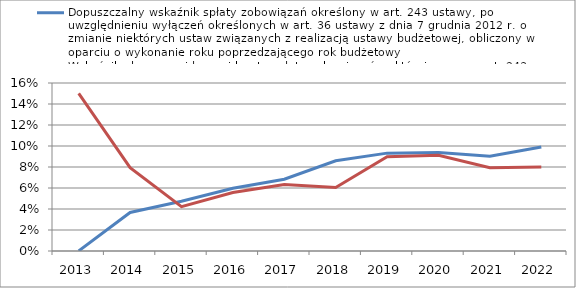
| Category | Dopuszczalny wskaźnik spłaty zobowiązań określony w art. 243 ustawy, po uwzględnieniu wyłączeń określonych w art. 36 ustawy z dnia 7 grudnia 2012 r. o zmianie niektórych ustaw związanych z realizacją ustawy budżetowej, obliczony w oparciu o wykonanie roku | Wskaźnik planowanej łącznej kwoty spłaty zobowiązań, o której mowa w art. 243 ust. 1 ustawy do dochodów ogółem, bez uwzględnienia zobowiązań związku współtworzonego przez jednostkę samorządu terytorialnego i bez uwzględniania wyłączeń przypadających na da |
|---|---|---|
| 2013.0 | 0 | 0.15 |
| 2014.0 | 0.037 | 0.079 |
| 2015.0 | 0.047 | 0.042 |
| 2016.0 | 0.06 | 0.056 |
| 2017.0 | 0.068 | 0.063 |
| 2018.0 | 0.086 | 0.06 |
| 2019.0 | 0.093 | 0.09 |
| 2020.0 | 0.094 | 0.091 |
| 2021.0 | 0.09 | 0.079 |
| 2022.0 | 0.099 | 0.08 |